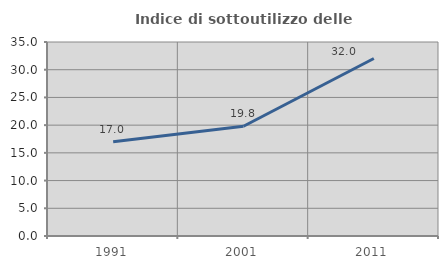
| Category | Indice di sottoutilizzo delle abitazioni  |
|---|---|
| 1991.0 | 16.994 |
| 2001.0 | 19.793 |
| 2011.0 | 32.016 |